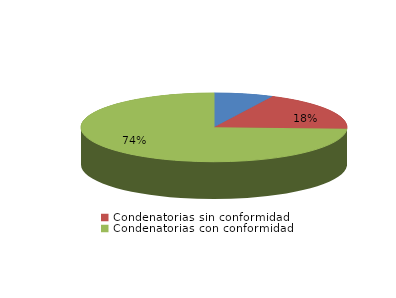
| Category | Series 0 |
|---|---|
| Absolutorias | 49 |
| Condenatorias sin conformidad | 125 |
| Condenatorias con conformidad | 504 |